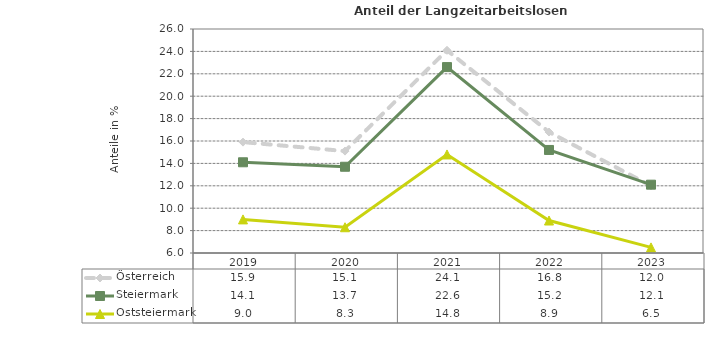
| Category | Österreich | Steiermark | Oststeiermark |
|---|---|---|---|
| 2023.0 | 12 | 12.1 | 6.5 |
| 2022.0 | 16.8 | 15.2 | 8.9 |
| 2021.0 | 24.1 | 22.6 | 14.8 |
| 2020.0 | 15.1 | 13.7 | 8.3 |
| 2019.0 | 15.9 | 14.1 | 9 |